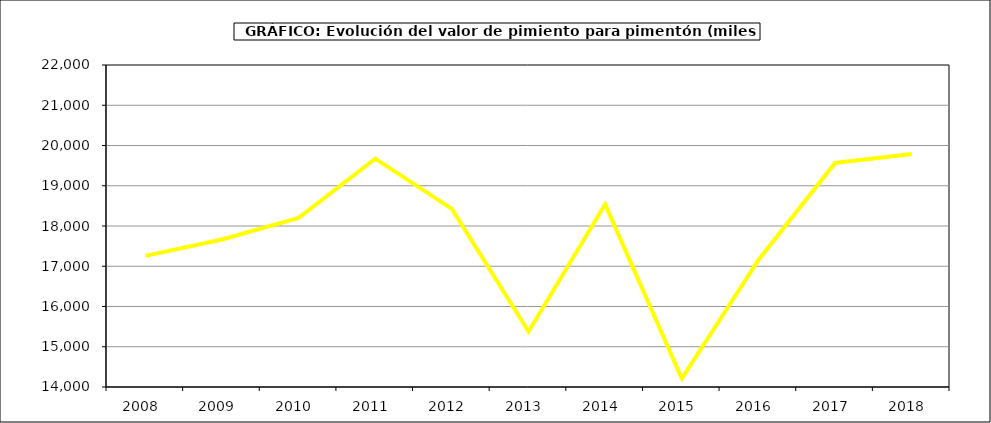
| Category | Valor |
|---|---|
| 2008.0 | 17258.828 |
| 2009.0 | 17665.33 |
| 2010.0 | 18201.072 |
| 2011.0 | 19672.3 |
| 2012.0 | 18426.65 |
| 2013.0 | 15378.158 |
| 2014.0 | 18538.464 |
| 2015.0 | 14208 |
| 2016.0 | 17155 |
| 2017.0 | 19566.151 |
| 2018.0 | 19789.623 |